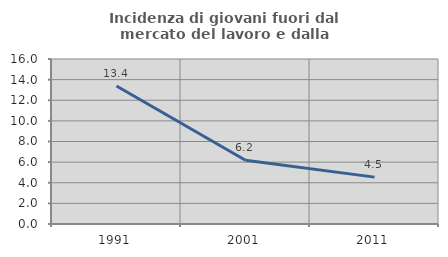
| Category | Incidenza di giovani fuori dal mercato del lavoro e dalla formazione  |
|---|---|
| 1991.0 | 13.389 |
| 2001.0 | 6.18 |
| 2011.0 | 4.545 |